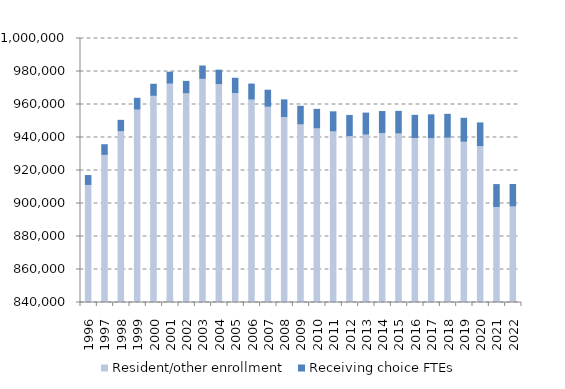
| Category | Resident/other enrollment | Receiving choice FTEs |
|---|---|---|
| 1996.0 | 910930.171 | 5996.829 |
| 1997.0 | 929165.48 | 6457.52 |
| 1998.0 | 943578.22 | 6826.78 |
| 1999.0 | 956577.51 | 7183.49 |
| 2000.0 | 964942.81 | 7317.19 |
| 2001.0 | 972319.21 | 7273.79 |
| 2002.0 | 966474.74 | 7540.26 |
| 2003.0 | 975239.49 | 8073.51 |
| 2004.0 | 971995.575 | 8822.425 |
| 2005.0 | 966642.23 | 9268.77 |
| 2006.0 | 962639.475 | 9731.525 |
| 2007.0 | 958323.26 | 10337.74 |
| 2008.0 | 952019.505 | 10786.495 |
| 2009.0 | 947609.775 | 11300.225 |
| 2010.0 | 945252.2 | 11800.8 |
| 2011.0 | 943372.38 | 12190.62 |
| 2012.0 | 940482.81 | 12886.19 |
| 2013.0 | 941418.38 | 13354.62 |
| 2014.0 | 942314.75 | 13424.25 |
| 2015.0 | 942097.7 | 13746.3 |
| 2016.0 | 939310.72 | 14118.28 |
| 2017.0 | 939320.96 | 14427.04 |
| 2018.0 | 939622.08 | 14411.92 |
| 2019.0 | 937110.46 | 14520.54 |
| 2020.0 | 934425.43 | 14402.57 |
| 2021.0 | 897549.27 | 13915.73 |
| 2022.0 | 897897.89 | 13631.11 |